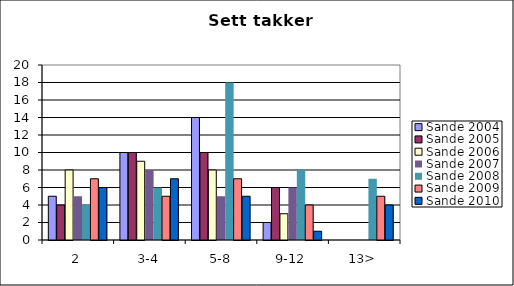
| Category | Sande 2004 | Sande 2005 | Sande 2006 | Sande 2007 | Sande 2008 | Sande 2009 | Sande 2010 |
|---|---|---|---|---|---|---|---|
| 2 | 5 | 4 | 8 | 5 | 4 | 7 | 6 |
| 3-4 | 10 | 10 | 9 | 8 | 6 | 5 | 7 |
| 5-8 | 14 | 10 | 8 | 5 | 18 | 7 | 5 |
| 9-12 | 2 | 6 | 3 | 6 | 8 | 4 | 1 |
| 13> | 0 | 0 | 0 | 0 | 7 | 5 | 4 |